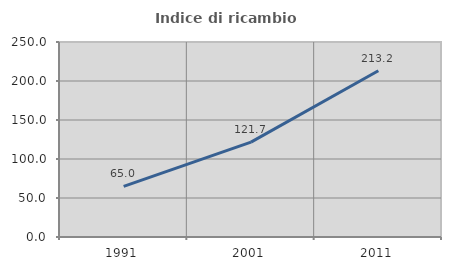
| Category | Indice di ricambio occupazionale  |
|---|---|
| 1991.0 | 65 |
| 2001.0 | 121.667 |
| 2011.0 | 213.208 |